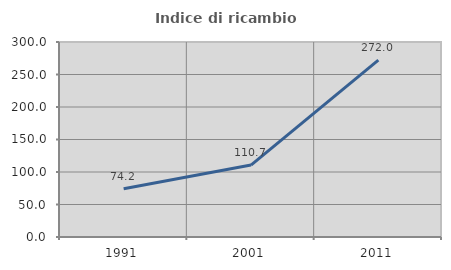
| Category | Indice di ricambio occupazionale  |
|---|---|
| 1991.0 | 74.237 |
| 2001.0 | 110.654 |
| 2011.0 | 272.018 |